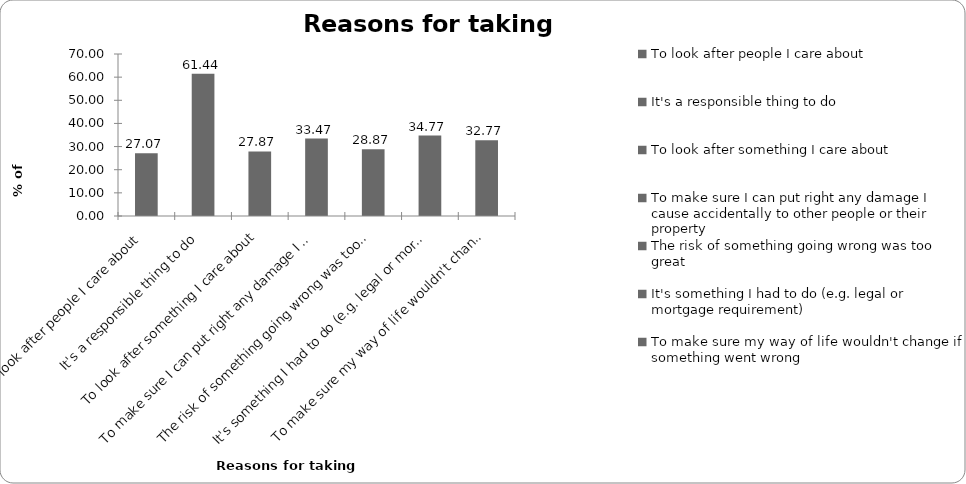
| Category | Reasons for taking insurance |
|---|---|
| To look after people I care about | 27.073 |
| It's a responsible thing to do | 61.439 |
| To look after something I care about | 27.872 |
| To make sure I can put right any damage I cause accidentally to other people or their property | 33.467 |
| The risk of something going wrong was too great | 28.871 |
| It's something I had to do (e.g. legal or mortgage requirement) | 34.765 |
| To make sure my way of life wouldn't change if something went wrong | 32.767 |